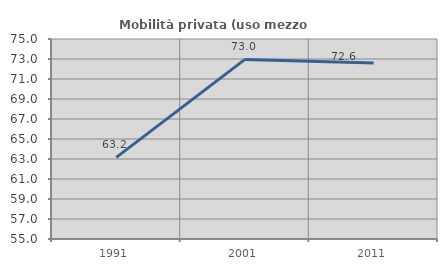
| Category | Mobilità privata (uso mezzo privato) |
|---|---|
| 1991.0 | 63.158 |
| 2001.0 | 72.961 |
| 2011.0 | 72.597 |